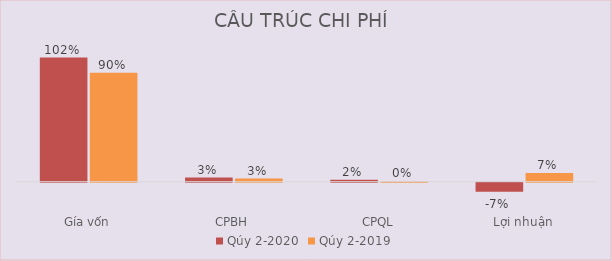
| Category | Qúy 2-2020 | Qúy 2-2019 |
|---|---|---|
| Gía vốn | 1.022 | 0.897 |
| CPBH | 0.034 | 0.026 |
| CPQL | 0.017 | 0.004 |
| Lợi nhuận | -0.073 | 0.073 |